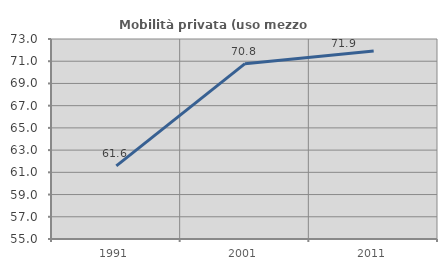
| Category | Mobilità privata (uso mezzo privato) |
|---|---|
| 1991.0 | 61.582 |
| 2001.0 | 70.782 |
| 2011.0 | 71.922 |